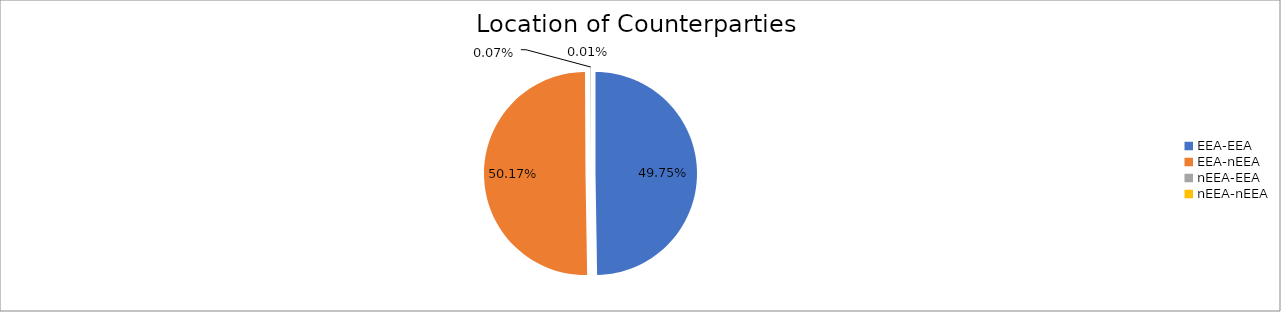
| Category | Series 0 |
|---|---|
| EEA-EEA | 5775777.903 |
| EEA-nEEA | 5825448.651 |
| nEEA-EEA | 7979.986 |
| nEEA-nEEA | 1531.389 |